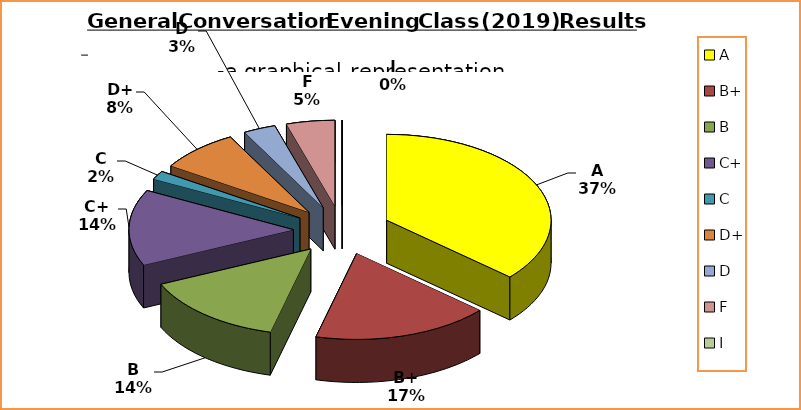
| Category | Series 0 |
|---|---|
| A | 23 |
| B+ | 11 |
| B | 9 |
| C+ | 9 |
| C | 1 |
| D+ | 5 |
| D | 2 |
| F | 3 |
| I | 0 |